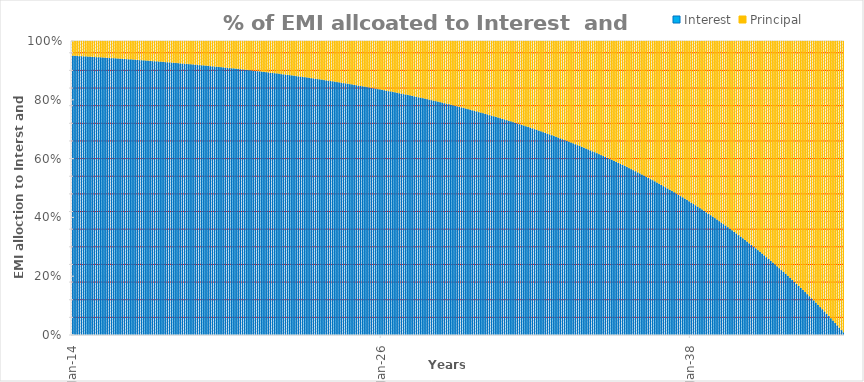
| Category | Interest | Principal |
|---|---|---|
| 2014-01-01 | 83333.333 | 4423.824 |
| 2014-02-01 | 83296.468 | 4460.689 |
| 2014-03-01 | 83259.296 | 4497.861 |
| 2014-04-01 | 83221.814 | 4535.343 |
| 2014-05-01 | 83184.019 | 4573.138 |
| 2014-06-01 | 83145.91 | 4611.247 |
| 2014-07-01 | 83107.482 | 4649.675 |
| 2014-08-01 | 83068.735 | 4688.422 |
| 2014-09-01 | 83029.665 | 4727.492 |
| 2014-10-01 | 82990.269 | 4766.888 |
| 2014-11-01 | 82950.545 | 4806.612 |
| 2014-12-01 | 82910.49 | 4846.667 |
| 2015-01-01 | 82870.101 | 4887.056 |
| 2015-02-01 | 82829.376 | 4927.781 |
| 2015-03-01 | 82788.311 | 4968.846 |
| 2015-04-01 | 82746.904 | 5010.253 |
| 2015-05-01 | 82705.152 | 5052.005 |
| 2015-06-01 | 82663.052 | 5094.105 |
| 2015-07-01 | 82620.601 | 5136.556 |
| 2015-08-01 | 82577.796 | 5179.361 |
| 2015-09-01 | 82534.635 | 5222.522 |
| 2015-10-01 | 82491.114 | 5266.043 |
| 2015-11-01 | 82447.23 | 5309.927 |
| 2015-12-01 | 82402.981 | 5354.176 |
| 2016-01-01 | 82358.363 | 5398.794 |
| 2016-02-01 | 82313.373 | 5443.784 |
| 2016-03-01 | 82268.008 | 5489.149 |
| 2016-04-01 | 82222.265 | 5534.892 |
| 2016-05-01 | 82176.141 | 5581.016 |
| 2016-06-01 | 82129.632 | 5627.525 |
| 2016-07-01 | 82082.736 | 5674.421 |
| 2016-08-01 | 82035.449 | 5721.708 |
| 2016-09-01 | 81987.769 | 5769.389 |
| 2016-10-01 | 81939.69 | 5817.467 |
| 2016-11-01 | 81891.211 | 5865.946 |
| 2016-12-01 | 81842.328 | 5914.829 |
| 2017-01-01 | 81793.038 | 5964.119 |
| 2017-02-01 | 81743.337 | 6013.82 |
| 2017-03-01 | 81693.222 | 6063.935 |
| 2017-04-01 | 81642.689 | 6114.468 |
| 2017-05-01 | 81591.735 | 6165.422 |
| 2017-06-01 | 81540.357 | 6216.8 |
| 2017-07-01 | 81488.55 | 6268.607 |
| 2017-08-01 | 81436.312 | 6320.845 |
| 2017-09-01 | 81383.638 | 6373.519 |
| 2017-10-01 | 81330.525 | 6426.632 |
| 2017-11-01 | 81276.97 | 6480.187 |
| 2017-12-01 | 81222.969 | 6534.188 |
| 2018-01-01 | 81168.517 | 6588.64 |
| 2018-02-01 | 81113.612 | 6643.545 |
| 2018-03-01 | 81058.249 | 6698.908 |
| 2018-04-01 | 81002.425 | 6754.732 |
| 2018-05-01 | 80946.135 | 6811.022 |
| 2018-06-01 | 80889.377 | 6867.78 |
| 2018-07-01 | 80832.145 | 6925.012 |
| 2018-08-01 | 80774.437 | 6982.72 |
| 2018-09-01 | 80716.247 | 7040.91 |
| 2018-10-01 | 80657.573 | 7099.584 |
| 2018-11-01 | 80598.41 | 7158.747 |
| 2018-12-01 | 80538.754 | 7218.403 |
| 2019-01-01 | 80478.6 | 7278.557 |
| 2019-02-01 | 80417.946 | 7339.211 |
| 2019-03-01 | 80356.786 | 7400.371 |
| 2019-04-01 | 80295.116 | 7462.041 |
| 2019-05-01 | 80232.932 | 7524.225 |
| 2019-06-01 | 80170.23 | 7586.927 |
| 2019-07-01 | 80107.006 | 7650.151 |
| 2019-08-01 | 80043.255 | 7713.902 |
| 2019-09-01 | 79978.972 | 7778.185 |
| 2019-10-01 | 79914.154 | 7843.003 |
| 2019-11-01 | 79848.796 | 7908.361 |
| 2019-12-01 | 79782.893 | 7974.264 |
| 2020-01-01 | 79716.44 | 8040.717 |
| 2020-02-01 | 79649.434 | 8107.723 |
| 2020-03-01 | 79581.87 | 8175.287 |
| 2020-04-01 | 79513.743 | 8243.414 |
| 2020-05-01 | 79445.048 | 8312.109 |
| 2020-06-01 | 79375.78 | 8381.377 |
| 2020-07-01 | 79305.935 | 8451.222 |
| 2020-08-01 | 79235.508 | 8521.649 |
| 2020-09-01 | 79164.495 | 8592.662 |
| 2020-10-01 | 79092.889 | 8664.268 |
| 2020-11-01 | 79020.687 | 8736.47 |
| 2020-12-01 | 78947.883 | 8809.274 |
| 2021-01-01 | 78874.472 | 8882.685 |
| 2021-02-01 | 78800.45 | 8956.707 |
| 2021-03-01 | 78725.811 | 9031.346 |
| 2021-04-01 | 78650.549 | 9106.608 |
| 2021-05-01 | 78574.661 | 9182.496 |
| 2021-06-01 | 78498.14 | 9259.017 |
| 2021-07-01 | 78420.982 | 9336.175 |
| 2021-08-01 | 78343.18 | 9413.977 |
| 2021-09-01 | 78264.731 | 9492.426 |
| 2021-10-01 | 78185.627 | 9571.53 |
| 2021-11-01 | 78105.864 | 9651.293 |
| 2021-12-01 | 78025.437 | 9731.72 |
| 2022-01-01 | 77944.339 | 9812.818 |
| 2022-02-01 | 77862.566 | 9894.591 |
| 2022-03-01 | 77780.111 | 9977.046 |
| 2022-04-01 | 77696.969 | 10060.188 |
| 2022-05-01 | 77613.134 | 10144.023 |
| 2022-06-01 | 77528.6 | 10228.557 |
| 2022-07-01 | 77443.362 | 10313.795 |
| 2022-08-01 | 77357.414 | 10399.743 |
| 2022-09-01 | 77270.749 | 10486.408 |
| 2022-10-01 | 77183.363 | 10573.794 |
| 2022-11-01 | 77095.248 | 10661.909 |
| 2022-12-01 | 77006.399 | 10750.758 |
| 2023-01-01 | 76916.809 | 10840.348 |
| 2023-02-01 | 76826.473 | 10930.684 |
| 2023-03-01 | 76735.384 | 11021.773 |
| 2023-04-01 | 76643.535 | 11113.622 |
| 2023-05-01 | 76550.922 | 11206.235 |
| 2023-06-01 | 76457.537 | 11299.62 |
| 2023-07-01 | 76363.373 | 11393.784 |
| 2023-08-01 | 76268.425 | 11488.732 |
| 2023-09-01 | 76172.686 | 11584.471 |
| 2023-10-01 | 76076.148 | 11681.009 |
| 2023-11-01 | 75978.807 | 11778.35 |
| 2023-12-01 | 75880.654 | 11876.503 |
| 2024-01-01 | 75781.683 | 11975.474 |
| 2024-02-01 | 75681.887 | 12075.27 |
| 2024-03-01 | 75581.26 | 12175.897 |
| 2024-04-01 | 75479.794 | 12277.363 |
| 2024-05-01 | 75377.483 | 12379.674 |
| 2024-06-01 | 75274.319 | 12482.838 |
| 2024-07-01 | 75170.295 | 12586.862 |
| 2024-08-01 | 75065.405 | 12691.752 |
| 2024-09-01 | 74959.64 | 12797.517 |
| 2024-10-01 | 74852.994 | 12904.163 |
| 2024-11-01 | 74745.459 | 13011.698 |
| 2024-12-01 | 74637.029 | 13120.128 |
| 2025-01-01 | 74527.694 | 13229.463 |
| 2025-02-01 | 74417.449 | 13339.708 |
| 2025-03-01 | 74306.284 | 13450.873 |
| 2025-04-01 | 74194.194 | 13562.963 |
| 2025-05-01 | 74081.169 | 13675.988 |
| 2025-06-01 | 73967.203 | 13789.955 |
| 2025-07-01 | 73852.286 | 13904.871 |
| 2025-08-01 | 73736.412 | 14020.745 |
| 2025-09-01 | 73619.573 | 14137.584 |
| 2025-10-01 | 73501.76 | 14255.397 |
| 2025-11-01 | 73382.965 | 14374.192 |
| 2025-12-01 | 73263.18 | 14493.977 |
| 2026-01-01 | 73142.396 | 14614.761 |
| 2026-02-01 | 73020.607 | 14736.55 |
| 2026-03-01 | 72897.802 | 14859.355 |
| 2026-04-01 | 72773.974 | 14983.183 |
| 2026-05-01 | 72649.114 | 15108.043 |
| 2026-06-01 | 72523.214 | 15233.943 |
| 2026-07-01 | 72396.265 | 15360.892 |
| 2026-08-01 | 72268.257 | 15488.9 |
| 2026-09-01 | 72139.183 | 15617.974 |
| 2026-10-01 | 72009.033 | 15748.124 |
| 2026-11-01 | 71877.799 | 15879.358 |
| 2026-12-01 | 71745.471 | 16011.686 |
| 2027-01-01 | 71612.04 | 16145.117 |
| 2027-02-01 | 71477.497 | 16279.66 |
| 2027-03-01 | 71341.834 | 16415.323 |
| 2027-04-01 | 71205.039 | 16552.118 |
| 2027-05-01 | 71067.105 | 16690.052 |
| 2027-06-01 | 70928.021 | 16829.136 |
| 2027-07-01 | 70787.778 | 16969.379 |
| 2027-08-01 | 70646.367 | 17110.79 |
| 2027-09-01 | 70503.777 | 17253.38 |
| 2027-10-01 | 70359.999 | 17397.158 |
| 2027-11-01 | 70215.022 | 17542.135 |
| 2027-12-01 | 70068.838 | 17688.319 |
| 2028-01-01 | 69921.435 | 17835.722 |
| 2028-02-01 | 69772.804 | 17984.353 |
| 2028-03-01 | 69622.935 | 18134.222 |
| 2028-04-01 | 69471.816 | 18285.341 |
| 2028-05-01 | 69319.438 | 18437.719 |
| 2028-06-01 | 69165.791 | 18591.366 |
| 2028-07-01 | 69010.863 | 18746.294 |
| 2028-08-01 | 68854.644 | 18902.513 |
| 2028-09-01 | 68697.123 | 19060.034 |
| 2028-10-01 | 68538.289 | 19218.868 |
| 2028-11-01 | 68378.132 | 19379.025 |
| 2028-12-01 | 68216.64 | 19540.517 |
| 2029-01-01 | 68053.802 | 19703.355 |
| 2029-02-01 | 67889.608 | 19867.549 |
| 2029-03-01 | 67724.045 | 20033.112 |
| 2029-04-01 | 67557.102 | 20200.055 |
| 2029-05-01 | 67388.768 | 20368.389 |
| 2029-06-01 | 67219.032 | 20538.125 |
| 2029-07-01 | 67047.881 | 20709.276 |
| 2029-08-01 | 66875.303 | 20881.854 |
| 2029-09-01 | 66701.288 | 21055.869 |
| 2029-10-01 | 66525.822 | 21231.335 |
| 2029-11-01 | 66348.895 | 21408.262 |
| 2029-12-01 | 66170.492 | 21586.665 |
| 2030-01-01 | 65990.604 | 21766.553 |
| 2030-02-01 | 65809.216 | 21947.941 |
| 2030-03-01 | 65626.316 | 22130.841 |
| 2030-04-01 | 65441.892 | 22315.265 |
| 2030-05-01 | 65255.932 | 22501.225 |
| 2030-06-01 | 65068.422 | 22688.735 |
| 2030-07-01 | 64879.349 | 22877.808 |
| 2030-08-01 | 64688.7 | 23068.457 |
| 2030-09-01 | 64496.463 | 23260.694 |
| 2030-10-01 | 64302.624 | 23454.533 |
| 2030-11-01 | 64107.17 | 23649.987 |
| 2030-12-01 | 63910.087 | 23847.07 |
| 2031-01-01 | 63711.361 | 24045.796 |
| 2031-02-01 | 63510.979 | 24246.178 |
| 2031-03-01 | 63308.928 | 24448.229 |
| 2031-04-01 | 63105.193 | 24651.964 |
| 2031-05-01 | 62899.76 | 24857.397 |
| 2031-06-01 | 62692.615 | 25064.542 |
| 2031-07-01 | 62483.743 | 25273.414 |
| 2031-08-01 | 62273.132 | 25484.025 |
| 2031-09-01 | 62060.765 | 25696.392 |
| 2031-10-01 | 61846.628 | 25910.529 |
| 2031-11-01 | 61630.707 | 26126.45 |
| 2031-12-01 | 61412.987 | 26344.17 |
| 2032-01-01 | 61193.452 | 26563.705 |
| 2032-02-01 | 60972.088 | 26785.069 |
| 2032-03-01 | 60748.879 | 27008.278 |
| 2032-04-01 | 60523.81 | 27233.347 |
| 2032-05-01 | 60296.865 | 27460.292 |
| 2032-06-01 | 60068.029 | 27689.128 |
| 2032-07-01 | 59837.287 | 27919.87 |
| 2032-08-01 | 59604.621 | 28152.536 |
| 2032-09-01 | 59370.017 | 28387.14 |
| 2032-10-01 | 59133.457 | 28623.7 |
| 2032-11-01 | 58894.926 | 28862.231 |
| 2032-12-01 | 58654.408 | 29102.749 |
| 2033-01-01 | 58411.885 | 29345.272 |
| 2033-02-01 | 58167.341 | 29589.816 |
| 2033-03-01 | 57920.759 | 29836.398 |
| 2033-04-01 | 57672.122 | 30085.035 |
| 2033-05-01 | 57421.414 | 30335.743 |
| 2033-06-01 | 57168.616 | 30588.541 |
| 2033-07-01 | 56913.711 | 30843.446 |
| 2033-08-01 | 56656.683 | 31100.474 |
| 2033-09-01 | 56397.512 | 31359.645 |
| 2033-10-01 | 56136.182 | 31620.975 |
| 2033-11-01 | 55872.674 | 31884.483 |
| 2033-12-01 | 55606.97 | 32150.187 |
| 2034-01-01 | 55339.051 | 32418.106 |
| 2034-02-01 | 55068.9 | 32688.257 |
| 2034-03-01 | 54796.498 | 32960.659 |
| 2034-04-01 | 54521.826 | 33235.331 |
| 2034-05-01 | 54244.865 | 33512.292 |
| 2034-06-01 | 53965.596 | 33791.561 |
| 2034-07-01 | 53684 | 34073.157 |
| 2034-08-01 | 53400.057 | 34357.1 |
| 2034-09-01 | 53113.748 | 34643.409 |
| 2034-10-01 | 52825.052 | 34932.105 |
| 2034-11-01 | 52533.952 | 35223.205 |
| 2034-12-01 | 52240.425 | 35516.732 |
| 2035-01-01 | 51944.452 | 35812.705 |
| 2035-02-01 | 51646.013 | 36111.144 |
| 2035-03-01 | 51345.087 | 36412.07 |
| 2035-04-01 | 51041.653 | 36715.504 |
| 2035-05-01 | 50735.69 | 37021.467 |
| 2035-06-01 | 50427.178 | 37329.979 |
| 2035-07-01 | 50116.095 | 37641.062 |
| 2035-08-01 | 49802.419 | 37954.738 |
| 2035-09-01 | 49486.13 | 38271.027 |
| 2035-10-01 | 49167.205 | 38589.952 |
| 2035-11-01 | 48845.622 | 38911.535 |
| 2035-12-01 | 48521.359 | 39235.798 |
| 2036-01-01 | 48194.394 | 39562.763 |
| 2036-02-01 | 47864.704 | 39892.453 |
| 2036-03-01 | 47532.267 | 40224.89 |
| 2036-04-01 | 47197.06 | 40560.097 |
| 2036-05-01 | 46859.059 | 40898.098 |
| 2036-06-01 | 46518.241 | 41238.916 |
| 2036-07-01 | 46174.584 | 41582.573 |
| 2036-08-01 | 45828.062 | 41929.095 |
| 2036-09-01 | 45478.653 | 42278.504 |
| 2036-10-01 | 45126.332 | 42630.825 |
| 2036-11-01 | 44771.075 | 42986.082 |
| 2036-12-01 | 44412.858 | 43344.299 |
| 2037-01-01 | 44051.656 | 43705.501 |
| 2037-02-01 | 43687.443 | 44069.714 |
| 2037-03-01 | 43320.195 | 44436.962 |
| 2037-04-01 | 42949.887 | 44807.27 |
| 2037-05-01 | 42576.494 | 45180.663 |
| 2037-06-01 | 42199.988 | 45557.169 |
| 2037-07-01 | 41820.345 | 45936.812 |
| 2037-08-01 | 41437.538 | 46319.619 |
| 2037-09-01 | 41051.541 | 46705.616 |
| 2037-10-01 | 40662.328 | 47094.829 |
| 2037-11-01 | 40269.871 | 47487.286 |
| 2037-12-01 | 39874.144 | 47883.013 |
| 2038-01-01 | 39475.119 | 48282.038 |
| 2038-02-01 | 39072.768 | 48684.389 |
| 2038-03-01 | 38667.065 | 49090.092 |
| 2038-04-01 | 38257.981 | 49499.176 |
| 2038-05-01 | 37845.488 | 49911.669 |
| 2038-06-01 | 37429.557 | 50327.6 |
| 2038-07-01 | 37010.16 | 50746.997 |
| 2038-08-01 | 36587.269 | 51169.888 |
| 2038-09-01 | 36160.853 | 51596.304 |
| 2038-10-01 | 35730.884 | 52026.273 |
| 2038-11-01 | 35297.332 | 52459.825 |
| 2038-12-01 | 34860.166 | 52896.991 |
| 2039-01-01 | 34419.358 | 53337.799 |
| 2039-02-01 | 33974.877 | 53782.281 |
| 2039-03-01 | 33526.691 | 54230.466 |
| 2039-04-01 | 33074.77 | 54682.387 |
| 2039-05-01 | 32619.084 | 55138.073 |
| 2039-06-01 | 32159.6 | 55597.557 |
| 2039-07-01 | 31696.287 | 56060.87 |
| 2039-08-01 | 31229.113 | 56528.044 |
| 2039-09-01 | 30758.046 | 56999.111 |
| 2039-10-01 | 30283.053 | 57474.104 |
| 2039-11-01 | 29804.102 | 57953.055 |
| 2039-12-01 | 29321.16 | 58435.997 |
| 2040-01-01 | 28834.194 | 58922.963 |
| 2040-02-01 | 28343.169 | 59413.988 |
| 2040-03-01 | 27848.052 | 59909.105 |
| 2040-04-01 | 27348.81 | 60408.347 |
| 2040-05-01 | 26845.407 | 60911.75 |
| 2040-06-01 | 26337.809 | 61419.348 |
| 2040-07-01 | 25825.981 | 61931.176 |
| 2040-08-01 | 25309.888 | 62447.269 |
| 2040-09-01 | 24789.494 | 62967.663 |
| 2040-10-01 | 24264.764 | 63492.393 |
| 2040-11-01 | 23735.66 | 64021.497 |
| 2040-12-01 | 23202.148 | 64555.009 |
| 2041-01-01 | 22664.189 | 65092.968 |
| 2041-02-01 | 22121.748 | 65635.409 |
| 2041-03-01 | 21574.786 | 66182.371 |
| 2041-04-01 | 21023.266 | 66733.891 |
| 2041-05-01 | 20467.151 | 67290.006 |
| 2041-06-01 | 19906.401 | 67850.756 |
| 2041-07-01 | 19340.978 | 68416.179 |
| 2041-08-01 | 18770.843 | 68986.314 |
| 2041-09-01 | 18195.957 | 69561.2 |
| 2041-10-01 | 17616.28 | 70140.877 |
| 2041-11-01 | 17031.773 | 70725.384 |
| 2041-12-01 | 16442.395 | 71314.762 |
| 2042-01-01 | 15848.105 | 71909.052 |
| 2042-02-01 | 15248.863 | 72508.294 |
| 2042-03-01 | 14644.627 | 73112.53 |
| 2042-04-01 | 14035.356 | 73721.801 |
| 2042-05-01 | 13421.008 | 74336.149 |
| 2042-06-01 | 12801.54 | 74955.617 |
| 2042-07-01 | 12176.91 | 75580.247 |
| 2042-08-01 | 11547.074 | 76210.083 |
| 2042-09-01 | 10911.99 | 76845.167 |
| 2042-10-01 | 10271.614 | 77485.543 |
| 2042-11-01 | 9625.901 | 78131.256 |
| 2042-12-01 | 8974.807 | 78782.35 |
| 2043-01-01 | 8318.288 | 79438.869 |
| 2043-02-01 | 7656.297 | 80100.86 |
| 2043-03-01 | 6988.79 | 80768.367 |
| 2043-04-01 | 6315.72 | 81441.437 |
| 2043-05-01 | 5637.042 | 82120.115 |
| 2043-06-01 | 4952.707 | 82804.45 |
| 2043-07-01 | 4262.67 | 83494.487 |
| 2043-08-01 | 3566.883 | 84190.274 |
| 2043-09-01 | 2865.297 | 84891.86 |
| 2043-10-01 | 2157.865 | 85599.292 |
| 2043-11-01 | 1444.538 | 86312.619 |
| 2043-12-01 | 725.266 | 87031.891 |